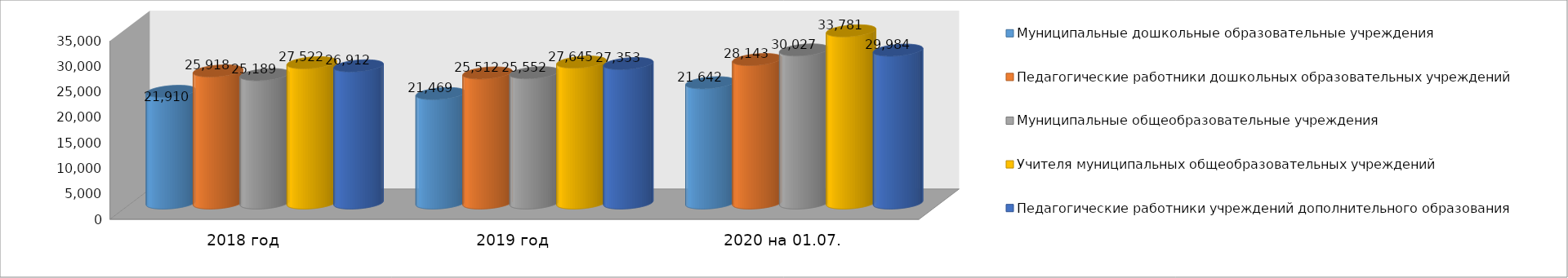
| Category | Муниципальные дошкольные образовательные учреждения | Педагогические работники дошкольных образовательных учреждений | Муниципальные общеобразовательные учреждения | Учителя муниципальных общеобразовательных учреждений | Педагогические работники учреждений дополнительного образования |
|---|---|---|---|---|---|
| 2018 год | 21910 | 25918 | 25189 | 27522 | 26912 |
| 2019 год | 21469 | 25512 | 25552 | 27645 | 27353 |
| 2020 на 01.07. | 23592 | 28143 | 30027 | 33781 | 29984 |